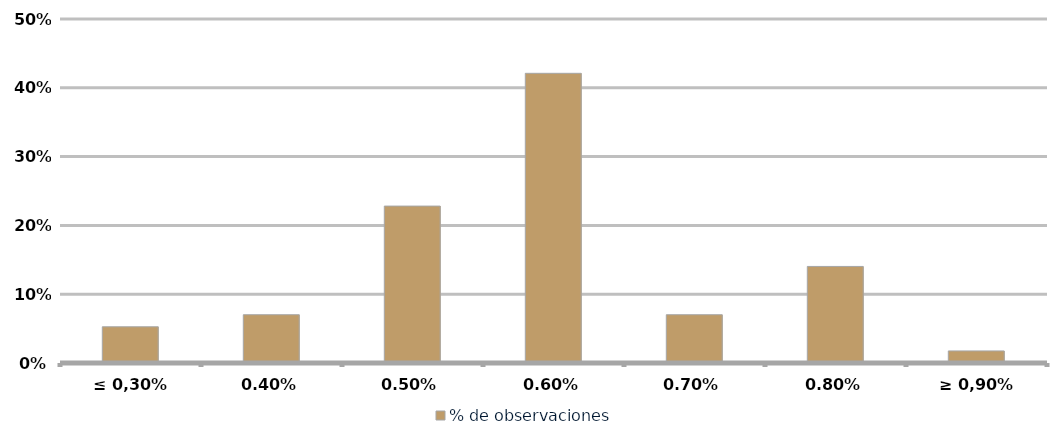
| Category | % de observaciones  |
|---|---|
| ≤ 0,30% | 0.053 |
| 0,40% | 0.07 |
| 0,50% | 0.228 |
| 0,60% | 0.421 |
| 0,70% | 0.07 |
| 0,80% | 0.14 |
| ≥ 0,90% | 0.018 |